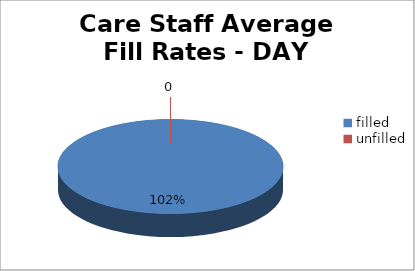
| Category | Series 0 |
|---|---|
| filled | 102 |
| unfilled | 0 |